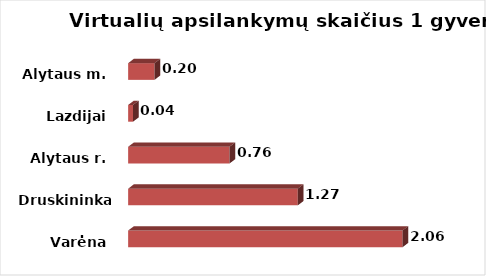
| Category | Series 0 |
|---|---|
| Varėna | 2.062 |
| Druskininkai  | 1.274 |
| Alytaus r. | 0.761 |
| Lazdijai | 0.037 |
| Alytaus m. | 0.198 |